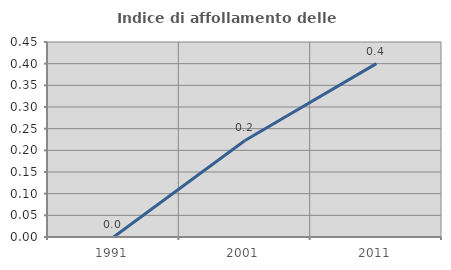
| Category | Indice di affollamento delle abitazioni  |
|---|---|
| 1991.0 | 0 |
| 2001.0 | 0.223 |
| 2011.0 | 0.4 |